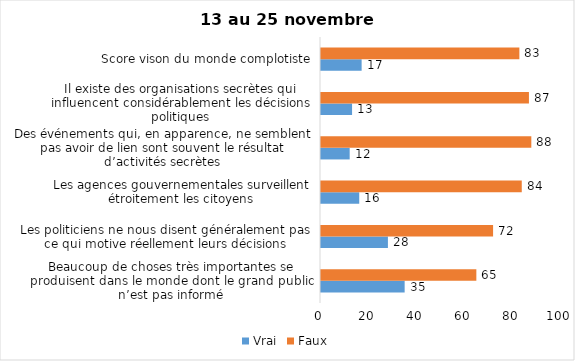
| Category | Vrai | Faux |
|---|---|---|
| Beaucoup de choses très importantes se produisent dans le monde dont le grand public n’est pas informé | 35 | 65 |
| Les politiciens ne nous disent généralement pas ce qui motive réellement leurs décisions | 28 | 72 |
| Les agences gouvernementales surveillent étroitement les citoyens | 16 | 84 |
| Des événements qui, en apparence, ne semblent pas avoir de lien sont souvent le résultat d’activités secrètes | 12 | 88 |
| Il existe des organisations secrètes qui influencent considérablement les décisions politiques | 13 | 87 |
| Score vison du monde complotiste | 17 | 83 |